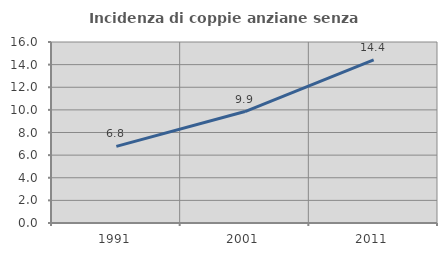
| Category | Incidenza di coppie anziane senza figli  |
|---|---|
| 1991.0 | 6.776 |
| 2001.0 | 9.852 |
| 2011.0 | 14.42 |